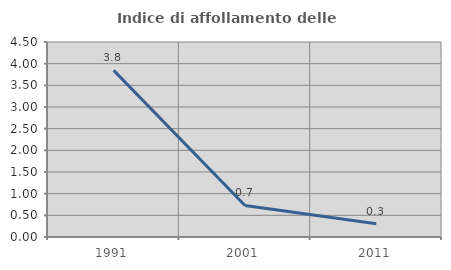
| Category | Indice di affollamento delle abitazioni  |
|---|---|
| 1991.0 | 3.846 |
| 2001.0 | 0.727 |
| 2011.0 | 0.306 |